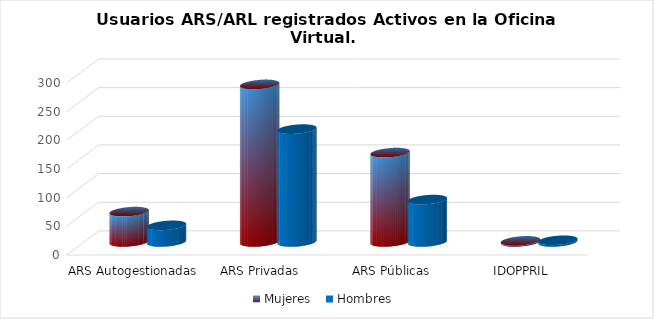
| Category | Mujeres | Hombres |
|---|---|---|
| ARS Autogestionadas | 53 | 29 |
| ARS Privadas | 275 | 197 |
| ARS Públicas | 156 | 74 |
| IDOPPRIL | 2 | 3 |